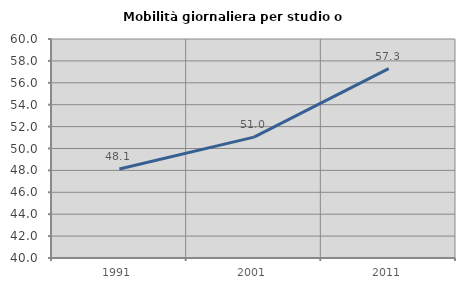
| Category | Mobilità giornaliera per studio o lavoro |
|---|---|
| 1991.0 | 48.12 |
| 2001.0 | 51.042 |
| 2011.0 | 57.292 |